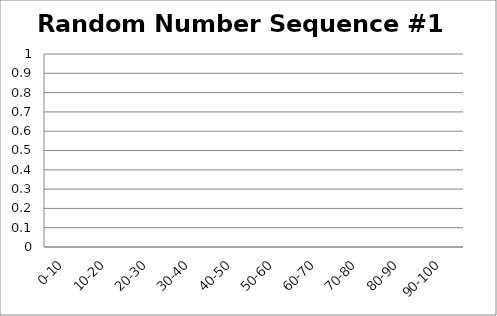
| Category | Random Number Sequence #1 |
|---|---|
| 0-10 | 0 |
| 10-20 | 0 |
| 20-30 | 0 |
| 30-40 | 0 |
| 40-50 | 0 |
| 50-60 | 0 |
| 60-70 | 0 |
| 70-80 | 0 |
| 80-90 | 0 |
| 90-100 | 0 |